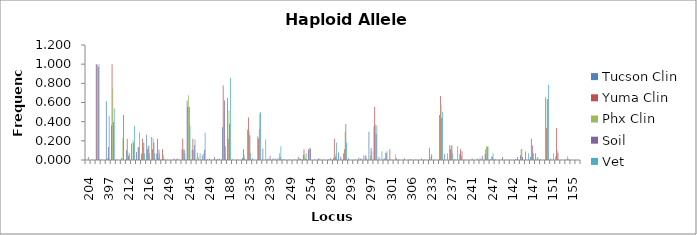
| Category | Tucson Clin | Yuma Clin | Phx Clin | Soil | Vet |
|---|---|---|---|---|---|
| 204 | 0.004 | 0 | 0 | 0.03 | 0 |
| 205 | 0 | 0 | 0.008 | 0 | 0 |
| 206 | 0.996 | 1 | 0.992 | 0.97 | 1 |
| 393 | 0.004 | 0 | 0 | 0 | 0 |
| 397 | 0.613 | 0 | 0.023 | 0.136 | 0.462 |
| 398 | 0.359 | 1 | 0.746 | 0.394 | 0.538 |
| 399 | 0.004 | 0 | 0 | 0 | 0 |
| 400 | 0.02 | 0 | 0.231 | 0.47 | 0 |
| 212 | 0.102 | 0.222 | 0.085 | 0.045 | 0.071 |
| 213 | 0.173 | 0 | 0.208 | 0.182 | 0.357 |
| 214 | 0.082 | 0 | 0.131 | 0.136 | 0.286 |
| 215 | 0.067 | 0.222 | 0.138 | 0.182 | 0.071 |
| 216 | 0.263 | 0.111 | 0.138 | 0.152 | 0.071 |
| 217 | 0.239 | 0.111 | 0.223 | 0.182 | 0.071 |
| 218 | 0.067 | 0.222 | 0.023 | 0.106 | 0.071 |
| 247 | 0.004 | 0.111 | 0.054 | 0.015 | 0 |
| 249 | 0.004 | 0 | 0 | 0 | 0 |
| 238 | 0 | 0 | 0 | 0.015 | 0 |
| 243 | 0.017 | 0 | 0.008 | 0 | 0 |
| 244 | 0.112 | 0.222 | 0.109 | 0.108 | 0.071 |
| 245 | 0.62 | 0.556 | 0.674 | 0.554 | 0.357 |
| 246 | 0.107 | 0.222 | 0.101 | 0.154 | 0.214 |
| 247 | 0.074 | 0 | 0.031 | 0 | 0.071 |
| 248 | 0.05 | 0 | 0.07 | 0.108 | 0.286 |
| 249 | 0.008 | 0 | 0 | 0.015 | 0 |
| 250 | 0 | 0 | 0.008 | 0.031 | 0 |
| 253 | 0.012 | 0 | 0 | 0.015 | 0 |
| 186 | 0.341 | 0.778 | 0.485 | 0.621 | 0.143 |
| 188 | 0.647 | 0.222 | 0.515 | 0.379 | 0.857 |
| 190 | 0.008 | 0 | 0 | 0 | 0 |
| 210 | 0.004 | 0 | 0 | 0 | 0 |
| 227 | 0.023 | 0.111 | 0.054 | 0.015 | 0 |
| 235 | 0.318 | 0.444 | 0.3 | 0.258 | 0.071 |
| 236 | 0.019 | 0 | 0 | 0 | 0 |
| 237 | 0.244 | 0.222 | 0.323 | 0.485 | 0.5 |
| 238 | 0.12 | 0 | 0 | 0 | 0.214 |
| 239 | 0.016 | 0 | 0.008 | 0.045 | 0 |
| 240 | 0.016 | 0 | 0 | 0.015 | 0 |
| 241 | 0.019 | 0 | 0.069 | 0.03 | 0.143 |
| 247 | 0.008 | 0 | 0.008 | 0 | 0 |
| 249 | 0.004 | 0 | 0.008 | 0 | 0 |
| 250 | 0 | 0 | 0.008 | 0 | 0 |
| 251 | 0.035 | 0 | 0.015 | 0.015 | 0 |
| 252 | 0.054 | 0.111 | 0.054 | 0.015 | 0.071 |
| 254 | 0.109 | 0.111 | 0.131 | 0.121 | 0 |
| 255 | 0 | 0 | 0.008 | 0 | 0 |
| 256 | 0.016 | 0 | 0.015 | 0 | 0 |
| 285 | 0.004 | 0 | 0 | 0 | 0 |
| 289 | 0.009 | 0 | 0 | 0.018 | 0 |
| 290 | 0.022 | 0.222 | 0.069 | 0.036 | 0.182 |
| 291 | 0.078 | 0 | 0 | 0.036 | 0 |
| 292 | 0.069 | 0.111 | 0.293 | 0.375 | 0.182 |
| 293 | 0.017 | 0 | 0 | 0 | 0 |
| 294 | 0 | 0 | 0.009 | 0 | 0 |
| 295 | 0.026 | 0 | 0.009 | 0.018 | 0 |
| 296 | 0.048 | 0 | 0.052 | 0.036 | 0 |
| 297 | 0.294 | 0 | 0.043 | 0.125 | 0.091 |
| 298 | 0.351 | 0.556 | 0.371 | 0.268 | 0.364 |
| 299 | 0.03 | 0 | 0 | 0 | 0.091 |
| 300 | 0.022 | 0 | 0.078 | 0.071 | 0.091 |
| 301 | 0 | 0.111 | 0.009 | 0 | 0 |
| 302 | 0 | 0 | 0.06 | 0.018 | 0 |
| 304 | 0.004 | 0 | 0 | 0 | 0 |
| 305 | 0.017 | 0 | 0 | 0 | 0 |
| 306 | 0.009 | 0 | 0.009 | 0 | 0 |
| 221 | 0 | 0 | 0.008 | 0 | 0 |
| 227 | 0 | 0 | 0 | 0.015 | 0 |
| 231 | 0.004 | 0 | 0 | 0 | 0 |
| 233 | 0.128 | 0 | 0.031 | 0.061 | 0 |
| 234 | 0.004 | 0 | 0 | 0 | 0 |
| 235 | 0.469 | 0.667 | 0.577 | 0.439 | 0.5 |
| 236 | 0.062 | 0 | 0 | 0 | 0.071 |
| 237 | 0.155 | 0.111 | 0.154 | 0.152 | 0.071 |
| 238 | 0.008 | 0 | 0 | 0 | 0.143 |
| 239 | 0.062 | 0.111 | 0.038 | 0.091 | 0 |
| 240 | 0.004 | 0 | 0 | 0 | 0 |
| 241 | 0 | 0 | 0 | 0.015 | 0 |
| 242 | 0 | 0 | 0 | 0.015 | 0 |
| 243 | 0.019 | 0 | 0.008 | 0.045 | 0 |
| 245 | 0.066 | 0.111 | 0.146 | 0.136 | 0.143 |
| 247 | 0.008 | 0 | 0.038 | 0.03 | 0.071 |
| 249 | 0.012 | 0 | 0 | 0 | 0 |
| 140 | 0 | 0 | 0.008 | 0.03 | 0 |
| 141 | 0.004 | 0 | 0 | 0 | 0 |
| 142 | 0.004 | 0 | 0 | 0 | 0 |
| 143 | 0.012 | 0 | 0.008 | 0.03 | 0 |
| 145 | 0.051 | 0.111 | 0.115 | 0.03 | 0 |
| 146 | 0.089 | 0 | 0 | 0 | 0.071 |
| 147 | 0.031 | 0.222 | 0.085 | 0.152 | 0.071 |
| 148 | 0.07 | 0 | 0.015 | 0.03 | 0 |
| 149 | 0.012 | 0 | 0 | 0 | 0 |
| 150 | 0.654 | 0.333 | 0.631 | 0.636 | 0.786 |
| 151 | 0.016 | 0 | 0 | 0 | 0.071 |
| 152 | 0.039 | 0.333 | 0.1 | 0.076 | 0 |
| 153 | 0.004 | 0 | 0 | 0 | 0 |
| 154 | 0.008 | 0 | 0.038 | 0.015 | 0 |
| 155 | 0.004 | 0 | 0 | 0 | 0 |
| 156 | 0.004 | 0 | 0 | 0 | 0 |